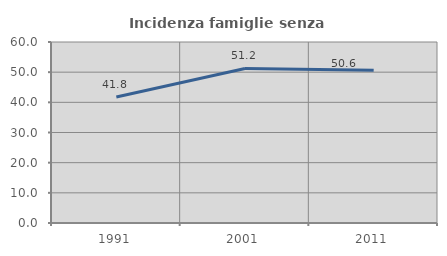
| Category | Incidenza famiglie senza nuclei |
|---|---|
| 1991.0 | 41.791 |
| 2001.0 | 51.22 |
| 2011.0 | 50.617 |